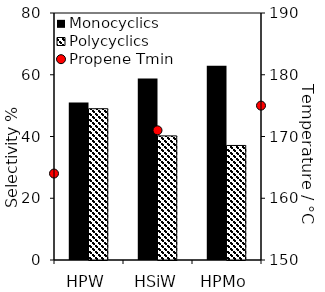
| Category | Monocyclics | Polycyclics |
|---|---|---|
| HPW | 51.006 | 48.994 |
| HSiW | 58.8 | 40.2 |
| HPMo | 62.9 | 37.1 |